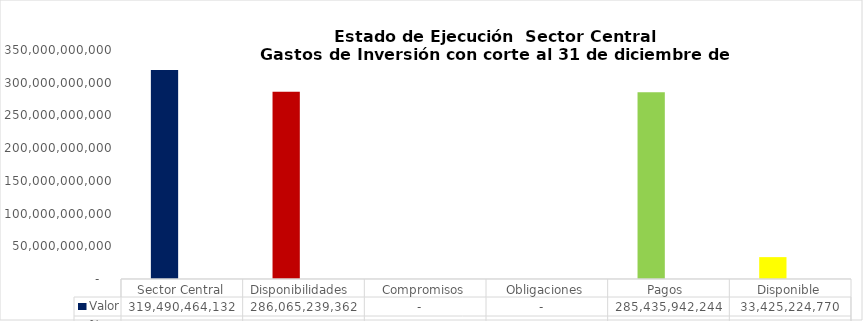
| Category | Valor | % |
|---|---|---|
| Sector Central | 319490464131.91 | 1 |
| Disponibilidades  | 286065239361.55 | 0.895 |
| Compromisos | 0 | 0 |
| Obligaciones | 0 | 0 |
| Pagos  | 285435942243.58 | 0 |
| Disponible | 33425224770.36 | 0.105 |